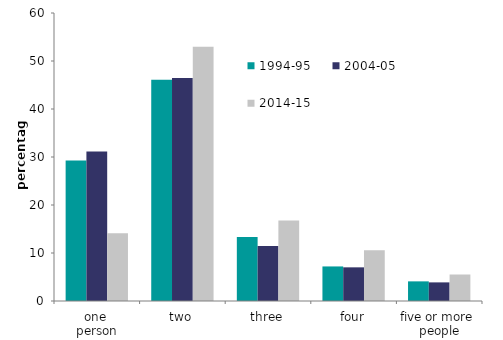
| Category | 1994-95 | 2004-05 | 2014-15 |
|---|---|---|---|
| one 
person | 29.278 | 31.155 | 14.137 |
| two | 46.1 | 46.477 | 52.973 |
| three | 13.332 | 11.476 | 16.792 |
| four | 7.2 | 7.012 | 10.578 |
| five or more 
people | 4.09 | 3.879 | 5.52 |